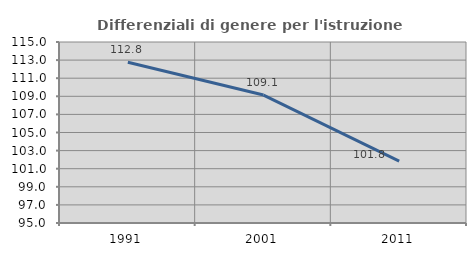
| Category | Differenziali di genere per l'istruzione superiore |
|---|---|
| 1991.0 | 112.754 |
| 2001.0 | 109.135 |
| 2011.0 | 101.847 |